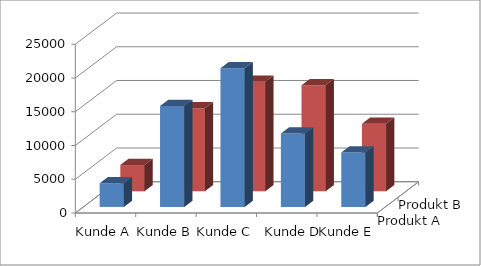
| Category | Produkt A | Produkt B |
|---|---|---|
| Kunde A | 3510 | 3890 |
| Kunde B | 14960 | 12320 |
| Kunde C | 20550 | 16250 |
| Kunde D | 10880 | 15700 |
| Kunde E | 8080 | 10000 |